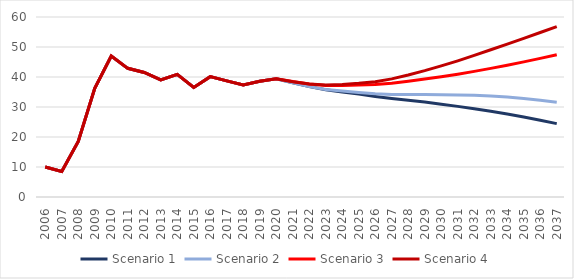
| Category | Scenario 1 | Scenario 2 | Scenario 3 | Scenario 4 |
|---|---|---|---|---|
| 2006 | 10.012 | 10.012 | 10.012 | 10.012 |
| 2007 | 8.507 | 8.507 | 8.507 | 8.507 |
| 2008 | 18.523 | 18.523 | 18.523 | 18.523 |
| 2009 | 36.251 | 36.251 | 36.251 | 36.251 |
| 2010 | 46.992 | 46.992 | 46.992 | 46.992 |
| 2011 | 42.89 | 42.89 | 42.89 | 42.89 |
| 2012 | 41.516 | 41.516 | 41.516 | 41.516 |
| 2013 | 39.027 | 39.027 | 39.027 | 39.027 |
| 2014 | 40.879 | 40.879 | 40.879 | 40.879 |
| 2015 | 36.518 | 36.518 | 36.518 | 36.518 |
| 2016 | 40.119 | 40.119 | 40.119 | 40.119 |
| 2017 | 38.716 | 38.716 | 38.716 | 38.716 |
| 2018 | 37.349 | 37.349 | 37.349 | 37.349 |
| 2019 | 38.588 | 38.588 | 38.588 | 38.588 |
| 2020 | 39.4 | 39.4 | 39.4 | 39.4 |
| 2021 | 38.11 | 38.054 | 38.485 | 38.43 |
| 2022 | 36.784 | 36.793 | 37.647 | 37.656 |
| 2023 | 35.726 | 35.849 | 37.19 | 37.316 |
| 2024 | 35.007 | 35.336 | 37.197 | 37.538 |
| 2025 | 34.289 | 34.841 | 37.323 | 37.9 |
| 2026 | 33.523 | 34.407 | 37.514 | 38.453 |
| 2027 | 32.859 | 34.188 | 37.94 | 39.376 |
| 2028 | 32.281 | 34.172 | 38.589 | 40.673 |
| 2029 | 31.648 | 34.147 | 39.306 | 42.116 |
| 2030 | 30.948 | 34.103 | 40.078 | 43.698 |
| 2031 | 30.206 | 34.015 | 40.936 | 45.394 |
| 2032 | 29.419 | 33.876 | 41.879 | 47.203 |
| 2033 | 28.564 | 33.643 | 42.877 | 49.069 |
| 2034 | 27.639 | 33.295 | 43.93 | 50.966 |
| 2035 | 26.649 | 32.834 | 45.042 | 52.89 |
| 2036 | 25.591 | 32.25 | 46.214 | 54.828 |
| 2037 | 24.463 | 31.569 | 47.439 | 56.817 |